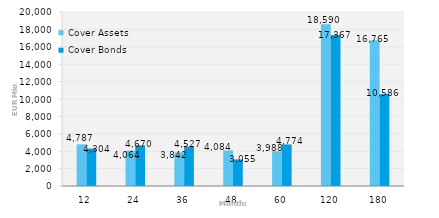
| Category | Cover Assets | Cover Bonds |
|---|---|---|
| 12.0 | 4787.032 | 4304.246 |
| 24.0 | 4064.368 | 4670.41 |
| 36.0 | 3841.903 | 4526.5 |
| 48.0 | 4084.185 | 3055 |
| 60.0 | 3988.21 | 4774.233 |
| 120.0 | 18590.26 | 17367.401 |
| 180.0 | 16765.057 | 10585.951 |